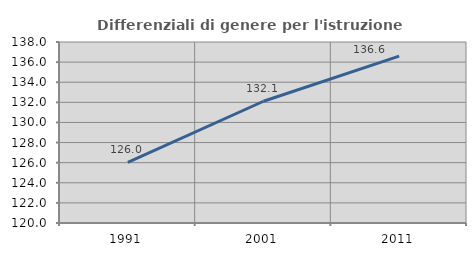
| Category | Differenziali di genere per l'istruzione superiore |
|---|---|
| 1991.0 | 126.031 |
| 2001.0 | 132.108 |
| 2011.0 | 136.601 |